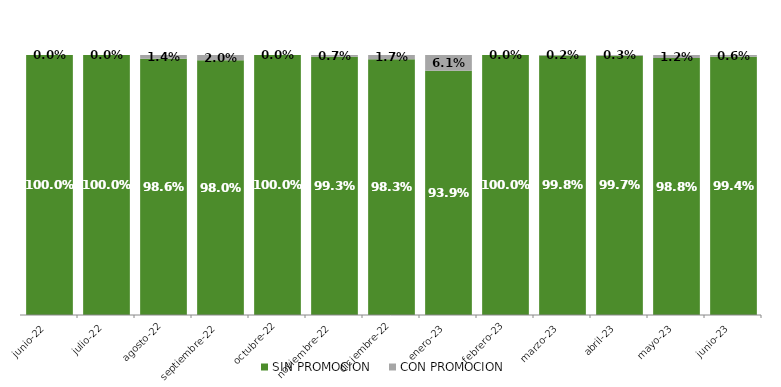
| Category | SIN PROMOCION   | CON PROMOCION   |
|---|---|---|
| 2022-06-01 | 1 | 0 |
| 2022-07-01 | 1 | 0 |
| 2022-08-01 | 0.986 | 0.014 |
| 2022-09-01 | 0.98 | 0.02 |
| 2022-10-01 | 1 | 0 |
| 2022-11-01 | 0.993 | 0.007 |
| 2022-12-01 | 0.983 | 0.017 |
| 2023-01-01 | 0.939 | 0.061 |
| 2023-02-01 | 1 | 0 |
| 2023-03-01 | 0.998 | 0.002 |
| 2023-04-01 | 0.997 | 0.003 |
| 2023-05-01 | 0.988 | 0.012 |
| 2023-06-01 | 0.994 | 0.006 |